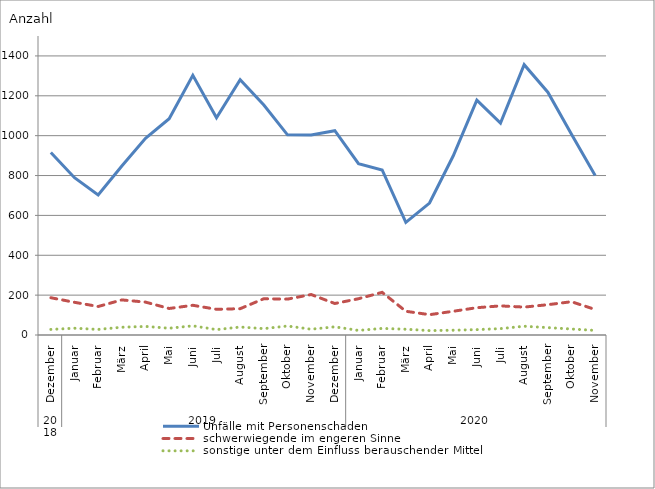
| Category | Unfälle mit Personenschaden | schwerwiegende im engeren Sinne | sonstige unter dem Einfluss berauschender Mittel |
|---|---|---|---|
| 0 | 916 | 187 | 28 |
| 1 | 789 | 164 | 34 |
| 2 | 702 | 143 | 28 |
| 3 | 848 | 176 | 39 |
| 4 | 987 | 165 | 43 |
| 5 | 1085 | 133 | 34 |
| 6 | 1303 | 149 | 46 |
| 7 | 1090 | 129 | 27 |
| 8 | 1281 | 132 | 40 |
| 9 | 1154 | 182 | 32 |
| 10 | 1004 | 180 | 45 |
| 11 | 1003 | 203 | 29 |
| 12 | 1025 | 158 | 41 |
| 13 | 860 | 182 | 23 |
| 14 | 828 | 214 | 33 |
| 15 | 565 | 119 | 29 |
| 16 | 662 | 102 | 22 |
| 17 | 898 | 119 | 24 |
| 18 | 1178 | 137 | 27 |
| 19 | 1063 | 146 | 32 |
| 20 | 1356 | 140 | 44 |
| 21 | 1218 | 152 | 37 |
| 22 | 1007 | 167 | 30 |
| 23 | 800 | 128 | 23 |